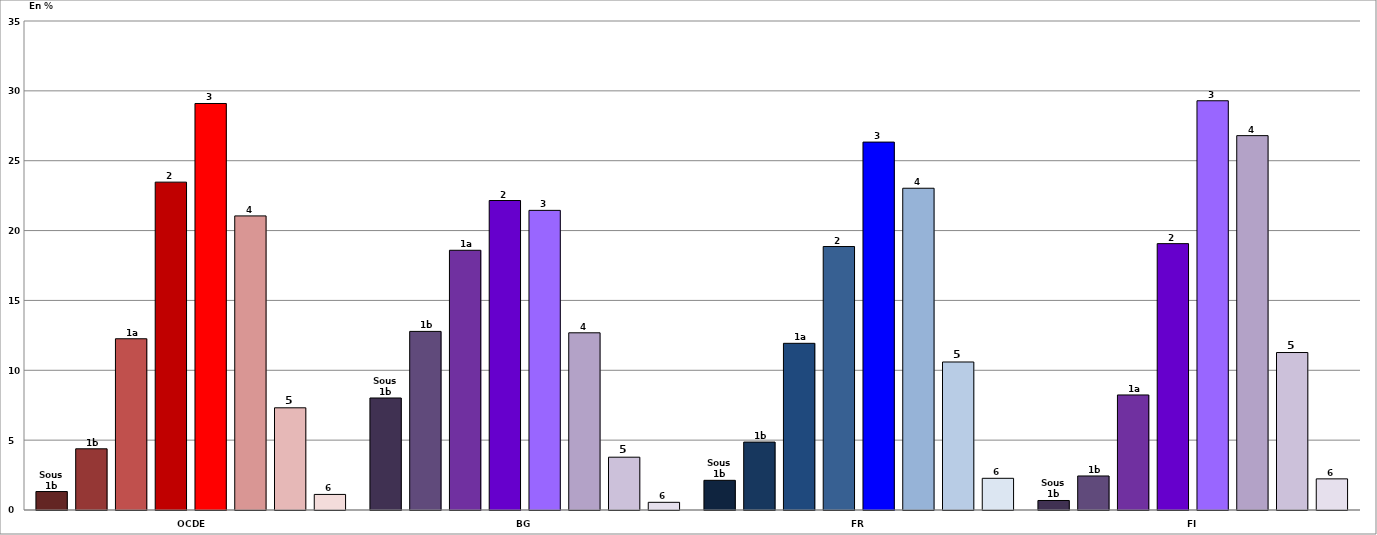
| Category | Sous 1b |  1b |  1a | 2 | 3 | 4 | 5 | 6 |
|---|---|---|---|---|---|---|---|---|
| OCDE | 1.321 | 4.38 | 12.257 | 23.467 | 29.096 | 21.049 | 7.315 | 1.114 |
| BG | 8.017 | 12.783 | 18.59 | 22.152 | 21.446 | 12.682 | 3.779 | 0.549 |
| FR | 2.125 | 4.862 | 11.93 | 18.858 | 26.333 | 23.03 | 10.594 | 2.268 |
| FI | 0.681 | 2.435 | 8.233 | 19.065 | 29.291 | 26.795 | 11.272 | 2.228 |